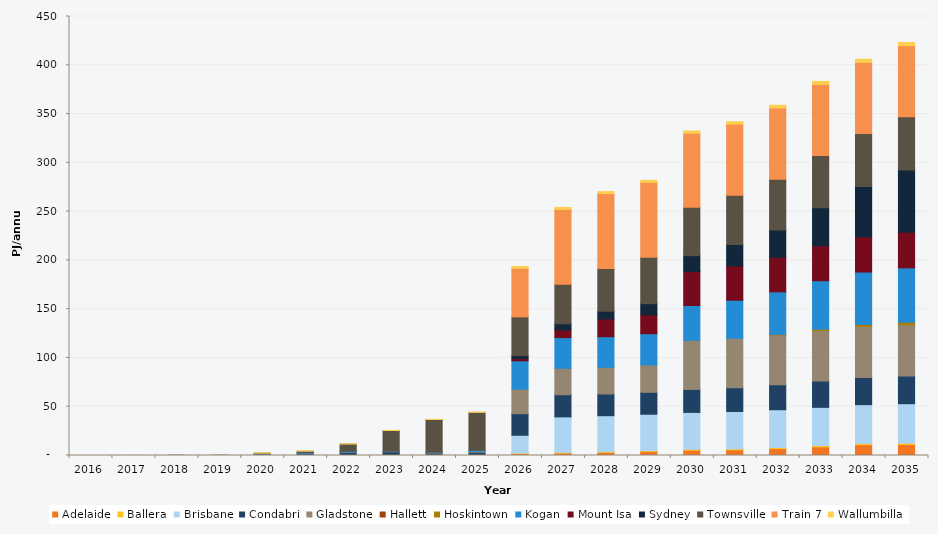
| Category | Adelaide | Ballera | Brisbane | Condabri | Gladstone | Hallett | Hoskintown | Kogan | Mount Isa | Sydney | Townsville | Train 7 | Wallumbilla |
|---|---|---|---|---|---|---|---|---|---|---|---|---|---|
| 2016.0 | 0 | 0 | 0 | 0 | 0 | 0 | 0 | 0 | 0 | 0 | 0 | 0 | 0 |
| 2017.0 | 0 | 0 | 0 | 0 | 0 | 0 | 0 | 0 | 0 | 0 | 0.036 | 0 | 0 |
| 2018.0 | 0 | 0 | 0 | 0 | 0 | 0 | 0 | 0 | 0 | 0 | 0.303 | 0 | 0 |
| 2019.0 | 0 | 0 | 0 | 0 | 0.005 | 0 | 0 | 0 | 0 | 0 | 0.315 | 0 | 0 |
| 2020.0 | 0 | 0 | 0 | 1.578 | 0.01 | 0 | 0 | 0.26 | 0 | 0 | 0.535 | 0 | 0.108 |
| 2021.0 | 0 | 0 | 0 | 2.127 | 0.076 | 0 | 0 | 0.734 | 0 | 0 | 1.462 | 0 | 0.218 |
| 2022.0 | 0 | 0 | 0 | 3.292 | 0.252 | 0 | 0 | 0.8 | 0 | 0 | 7.348 | 0 | 0.204 |
| 2023.0 | 0 | 0 | 0 | 3.79 | 0.494 | 0 | 0 | 0.274 | 0 | 0 | 21.084 | 0 | 0.151 |
| 2024.0 | 0 | 0 | 0 | 2.388 | 0.676 | 0 | 0 | 0.467 | 0 | 0 | 33.396 | 0 | 0.154 |
| 2025.0 | 0 | 0 | 0 | 3.241 | 0.961 | 0 | 0 | 1.21 | 0 | 0 | 38.763 | 0 | 0.26 |
| 2026.0 | 1.923 | 0.585 | 18.225 | 22.082 | 25.217 | 0 | 0 | 28.993 | 2.283 | 3.19 | 39.587 | 49.779 | 1.816 |
| 2027.0 | 2.484 | 0.703 | 36.396 | 22.715 | 27.032 | 0 | 0 | 31.555 | 7.869 | 6.241 | 40.46 | 76.794 | 2.031 |
| 2028.0 | 3.241 | 0.681 | 36.875 | 22.258 | 27.365 | 0 | 0 | 31.369 | 18.103 | 8.027 | 43.692 | 76.874 | 2.038 |
| 2029.0 | 4.278 | 0.715 | 37.306 | 22.448 | 28.045 | 0 | 0 | 32.028 | 19.356 | 11.491 | 47.504 | 76.765 | 2.062 |
| 2030.0 | 5.469 | 0.845 | 37.865 | 23.556 | 50.288 | 0 | 0 | 35.733 | 34.782 | 16.335 | 49.551 | 75.781 | 2.386 |
| 2031.0 | 5.819 | 0.964 | 38.3 | 24.339 | 50.748 | 0 | 0 | 39.021 | 35.102 | 21.878 | 50.582 | 72.889 | 2.53 |
| 2032.0 | 7.086 | 1.098 | 38.749 | 25.527 | 51.232 | 0 | 0.469 | 43.567 | 35.437 | 28.063 | 52.033 | 72.959 | 2.729 |
| 2033.0 | 8.846 | 1.269 | 39.24 | 26.939 | 51.776 | 0 | 1.41 | 49.686 | 35.784 | 39.02 | 53.574 | 72.86 | 3.03 |
| 2034.0 | 11.037 | 1.382 | 39.705 | 27.852 | 52.284 | 0 | 1.927 | 53.851 | 36.132 | 51.545 | 54.383 | 72.846 | 3.236 |
| 2035.0 | 11.217 | 1.436 | 40.458 | 28.287 | 52.801 | 0.039 | 2.349 | 55.765 | 36.483 | 63.81 | 54.715 | 72.726 | 3.282 |